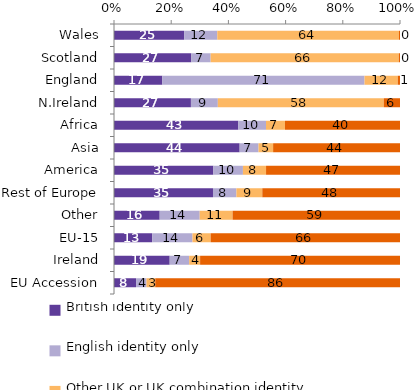
| Category | British identity only | English identity only | Other UK or UK combination identity | Foreign identity only |
|---|---|---|---|---|
| Wales | 24.519 | 11.588 | 63.534 | 0.36 |
| Scotland | 27.05 | 6.752 | 65.795 | 0.404 |
| England | 16.908 | 70.692 | 11.622 | 0.777 |
| N.Ireland | 26.896 | 9.409 | 58.017 | 5.678 |
| Africa | 43.472 | 9.665 | 6.64 | 40.223 |
| Asia | 43.933 | 6.603 | 5.103 | 44.361 |
| America | 34.741 | 10.34 | 8.086 | 46.833 |
| Rest of Europe | 34.61 | 8.19 | 9.055 | 48.146 |
| Other | 15.973 | 14.001 | 11.491 | 58.535 |
| EU-15 | 13.359 | 14.082 | 6.352 | 66.206 |
| Ireland | 19.473 | 6.805 | 3.833 | 69.89 |
| EU Accession | 7.725 | 3.625 | 3.076 | 85.575 |